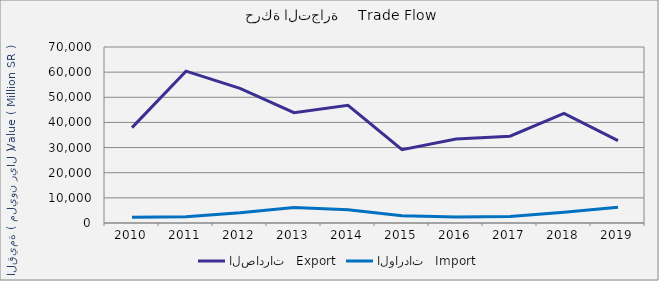
| Category | الصادرات   Export | الواردات   Import |
|---|---|---|
| 2010.0 | 37930541398 | 2242456549 |
| 2011.0 | 60398111968 | 2505525881 |
| 2012.0 | 53581567487 | 4043840643 |
| 2013.0 | 43875836006 | 6141905467 |
| 2014.0 | 46797600415 | 5264405083 |
| 2015.0 | 29145248198 | 2926294264 |
| 2016.0 | 33376647159 | 2343302676 |
| 2017.0 | 34511510199 | 2543688749 |
| 2018.0 | 43592756258 | 4319232322 |
| 2019.0 | 32735721568 | 6240262709 |